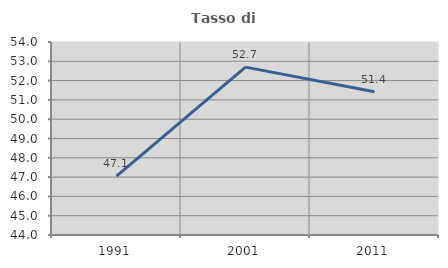
| Category | Tasso di occupazione   |
|---|---|
| 1991.0 | 47.053 |
| 2001.0 | 52.697 |
| 2011.0 | 51.419 |